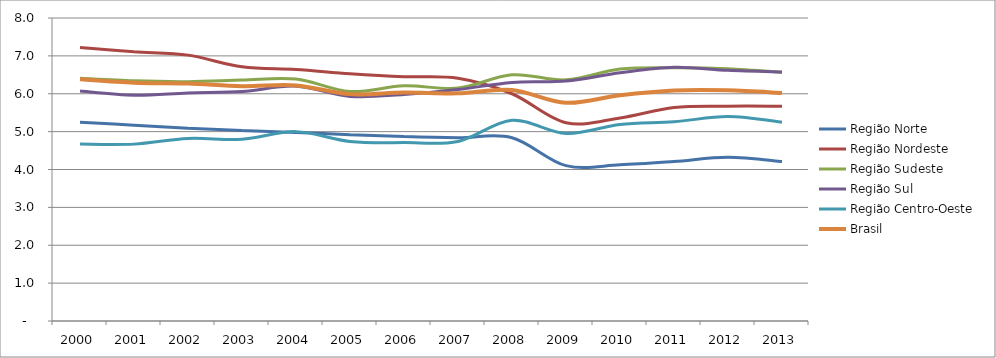
| Category | Região Norte | Região Nordeste | Região Sudeste | Região Sul | Região Centro-Oeste | Brasil |
|---|---|---|---|---|---|---|
| 2000.0 | 5.25 | 7.22 | 6.41 | 6.07 | 4.67 | 6.38 |
| 2001.0 | 5.17 | 7.11 | 6.34 | 5.96 | 4.67 | 6.29 |
| 2002.0 | 5.09 | 7.02 | 6.32 | 6.02 | 4.82 | 6.27 |
| 2003.0 | 5.03 | 6.71 | 6.36 | 6.06 | 4.8 | 6.2 |
| 2004.0 | 4.98 | 6.64 | 6.39 | 6.2 | 5 | 6.22 |
| 2005.0 | 4.92 | 6.53 | 6.06 | 5.93 | 4.74 | 5.99 |
| 2006.0 | 4.87 | 6.45 | 6.21 | 5.98 | 4.71 | 6.03 |
| 2007.0 | 4.84 | 6.41 | 6.15 | 6.11 | 4.74 | 6.01 |
| 2008.0 | 4.84 | 6 | 6.5 | 6.3 | 5.3 | 6.1 |
| 2009.0 | 4.101 | 5.234 | 6.367 | 6.334 | 4.954 | 5.761 |
| 2010.0 | 4.124 | 5.362 | 6.651 | 6.552 | 5.19 | 5.96 |
| 2011.0 | 4.212 | 5.637 | 6.687 | 6.7 | 5.261 | 6.084 |
| 2012.0 | 4.323 | 5.672 | 6.662 | 6.618 | 5.397 | 6.089 |
| 2013.0 | 4.208 | 5.671 | 6.565 | 6.571 | 5.25 | 6.02 |